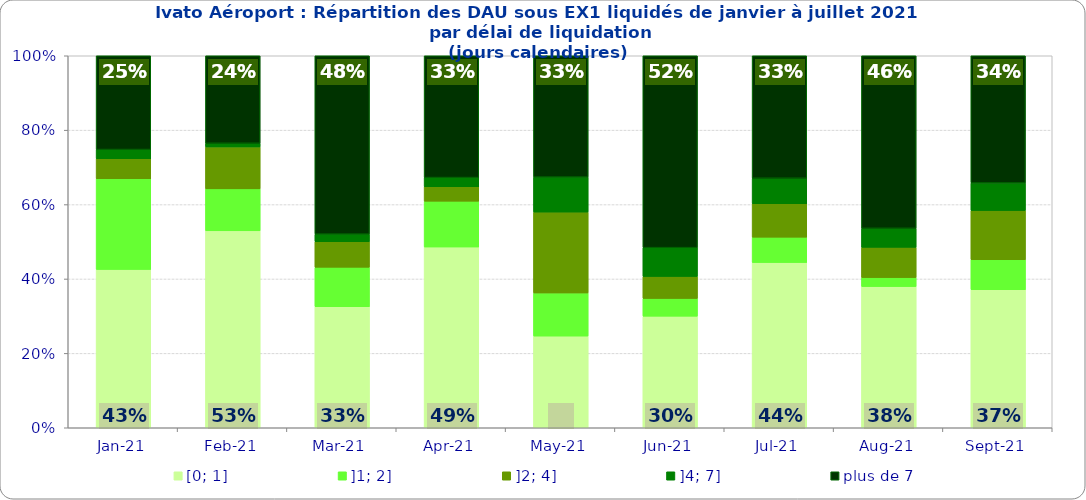
| Category | [0; 1] | ]1; 2] | ]2; 4] | ]4; 7] | plus de 7 |
|---|---|---|---|---|---|
| 2021-01-01 | 0.426 | 0.244 | 0.054 | 0.025 | 0.252 |
| 2021-02-01 | 0.529 | 0.113 | 0.113 | 0.01 | 0.235 |
| 2021-03-01 | 0.325 | 0.106 | 0.068 | 0.021 | 0.479 |
| 2021-04-01 | 0.486 | 0.123 | 0.039 | 0.025 | 0.327 |
| 2021-05-01 | 0.246 | 0.116 | 0.217 | 0.094 | 0.326 |
| 2021-06-01 | 0.3 | 0.048 | 0.059 | 0.077 | 0.516 |
| 2021-07-01 | 0.444 | 0.068 | 0.09 | 0.068 | 0.329 |
| 2021-08-01 | 0.38 | 0.024 | 0.081 | 0.051 | 0.464 |
| 2021-09-01 | 0.371 | 0.081 | 0.132 | 0.074 | 0.342 |